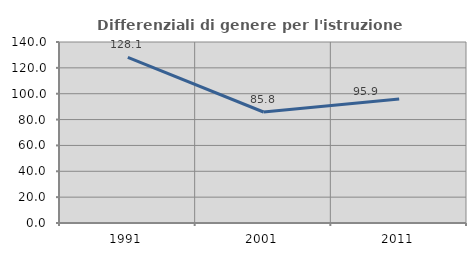
| Category | Differenziali di genere per l'istruzione superiore |
|---|---|
| 1991.0 | 128.112 |
| 2001.0 | 85.85 |
| 2011.0 | 95.926 |